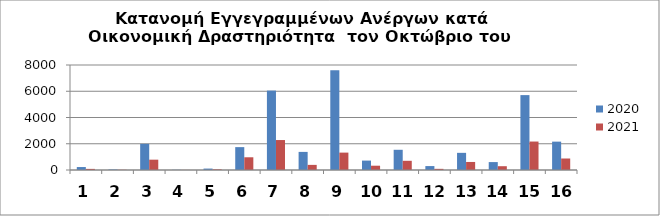
| Category | 2020 | 2021 |
|---|---|---|
| 0 | 225 | 85 |
| 1 | 40 | 17 |
| 2 | 1991 | 787 |
| 3 | 15 | 6 |
| 4 | 108 | 51 |
| 5 | 1743 | 969 |
| 6 | 6051 | 2283 |
| 7 | 1379 | 390 |
| 8 | 7602 | 1325 |
| 9 | 717 | 327 |
| 10 | 1540 | 701 |
| 11 | 299 | 88 |
| 12 | 1307 | 612 |
| 13 | 603 | 289 |
| 14 | 5706 | 2168 |
| 15 | 2161 | 876 |